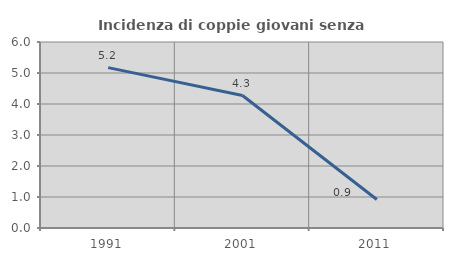
| Category | Incidenza di coppie giovani senza figli |
|---|---|
| 1991.0 | 5.172 |
| 2001.0 | 4.274 |
| 2011.0 | 0.917 |